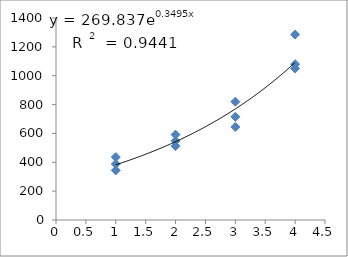
| Category | Series 0 |
|---|---|
| 1.0 | 436 |
| 1.0 | 344 |
| 1.0 | 388 |
| 2.0 | 548 |
| 2.0 | 592 |
| 2.0 | 512 |
| 3.0 | 645 |
| 3.0 | 820 |
| 3.0 | 715 |
| 4.0 | 1050 |
| 4.0 | 1080 |
| 4.0 | 1285 |